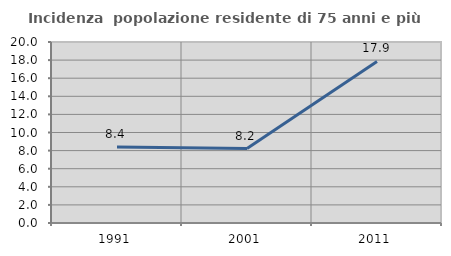
| Category | Incidenza  popolazione residente di 75 anni e più |
|---|---|
| 1991.0 | 8.387 |
| 2001.0 | 8.219 |
| 2011.0 | 17.857 |